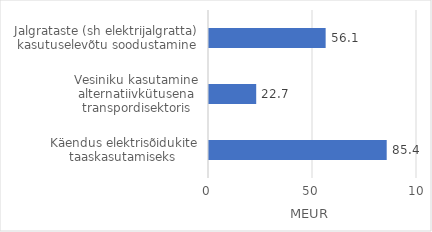
| Category | Series 0 |
|---|---|
| Käendus elektrisõidukite taaskasutamiseks  | 85.434 |
| Vesiniku kasutamine alternatiivkütusena transpordisektoris | 22.693 |
| Jalgrataste (sh elektrijalgratta) kasutuselevõtu soodustamine | 56.082 |